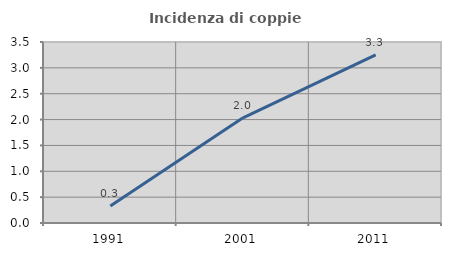
| Category | Incidenza di coppie miste |
|---|---|
| 1991.0 | 0.329 |
| 2001.0 | 2.034 |
| 2011.0 | 3.251 |